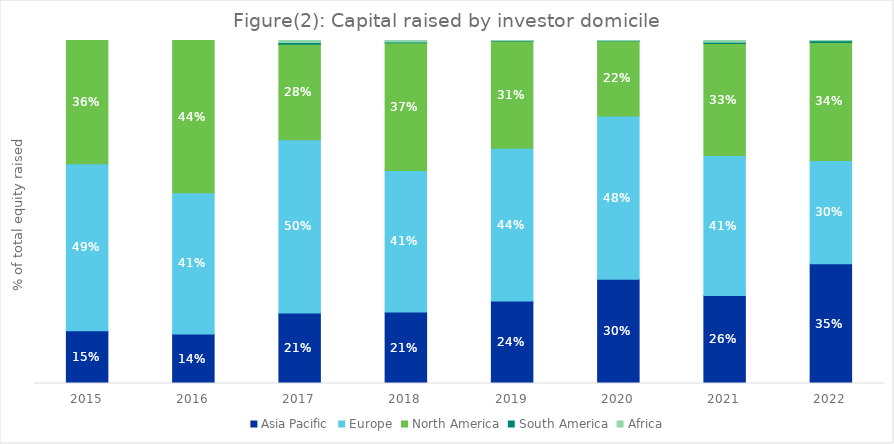
| Category | Asia Pacific | Europe | North America | South America | Africa |
|---|---|---|---|---|---|
| 2015.0 | 0.154 | 0.487 | 0.359 | 0 | 0 |
| 2016.0 | 0.144 | 0.411 | 0.444 | 0 | 0 |
| 2017.0 | 0.206 | 0.505 | 0.279 | 0.005 | 0.006 |
| 2018.0 | 0.208 | 0.413 | 0.373 | 0.002 | 0.005 |
| 2019.0 | 0.241 | 0.445 | 0.312 | 0.002 | 0.001 |
| 2020.0 | 0.304 | 0.476 | 0.218 | 0.001 | 0.001 |
| 2021.0 | 0.257 | 0.408 | 0.327 | 0.003 | 0.005 |
| 2022.0 | 0.349 | 0.301 | 0.344 | 0.005 | 0.001 |